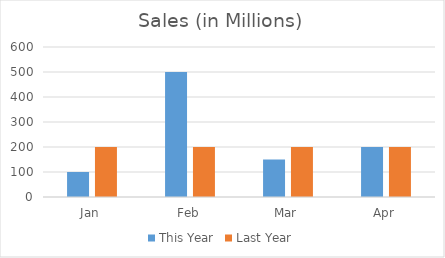
| Category | This Year | Last Year |
|---|---|---|
| Jan | 100 | 200 |
| Feb | 500 | 200 |
| Mar | 150 | 200 |
| Apr | 200 | 200 |